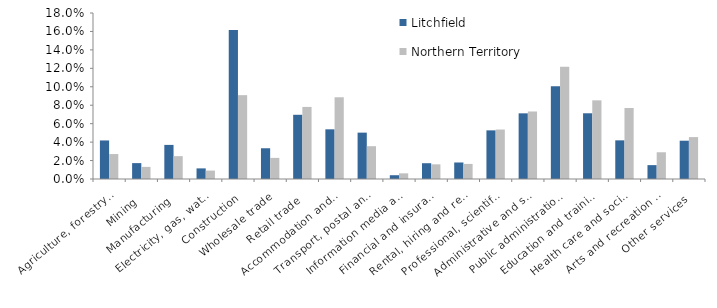
| Category | Litchfield | Northern Territory |
|---|---|---|
| Agriculture, forestry and fishing | 0.042 | 0.027 |
| Mining | 0.017 | 0.013 |
| Manufacturing | 0.037 | 0.025 |
| Electricity, gas, water and waste services | 0.012 | 0.009 |
| Construction | 0.162 | 0.091 |
| Wholesale trade | 0.033 | 0.023 |
| Retail trade | 0.07 | 0.078 |
| Accommodation and food services | 0.054 | 0.089 |
| Transport, postal and warehousing | 0.05 | 0.036 |
| Information media and telecommunications | 0.004 | 0.006 |
| Financial and insurance services | 0.017 | 0.016 |
| Rental, hiring and real estate services | 0.018 | 0.016 |
| Professional, scientific and technical services | 0.053 | 0.054 |
| Administrative and support services | 0.071 | 0.073 |
| Public administration and safety | 0.1 | 0.122 |
| Education and training | 0.071 | 0.085 |
| Health care and social assistance | 0.042 | 0.077 |
| Arts and recreation services | 0.015 | 0.029 |
| Other services | 0.042 | 0.045 |